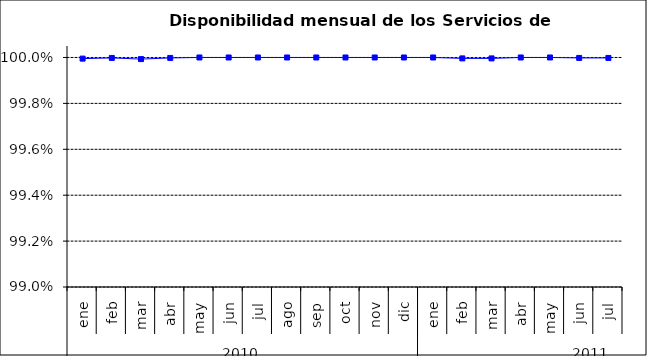
| Category | SCL * |
|---|---|
| 0 | 1 |
| 1 | 1 |
| 2 | 1 |
| 3 | 1 |
| 4 | 1 |
| 5 | 1 |
| 6 | 1 |
| 7 | 1 |
| 8 | 1 |
| 9 | 1 |
| 10 | 1 |
| 11 | 1 |
| 12 | 1 |
| 13 | 1 |
| 14 | 1 |
| 15 | 1 |
| 16 | 1 |
| 17 | 1 |
| 18 | 1 |